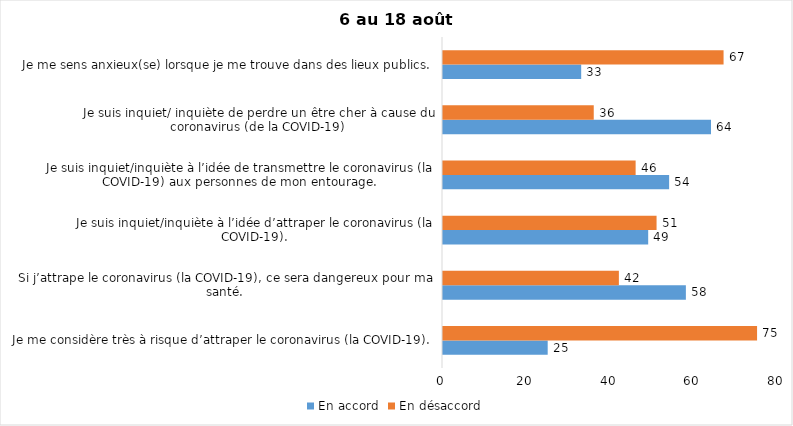
| Category | En accord | En désaccord |
|---|---|---|
| Je me considère très à risque d’attraper le coronavirus (la COVID-19). | 25 | 75 |
| Si j’attrape le coronavirus (la COVID-19), ce sera dangereux pour ma santé. | 58 | 42 |
| Je suis inquiet/inquiète à l’idée d’attraper le coronavirus (la COVID-19). | 49 | 51 |
| Je suis inquiet/inquiète à l’idée de transmettre le coronavirus (la COVID-19) aux personnes de mon entourage. | 54 | 46 |
| Je suis inquiet/ inquiète de perdre un être cher à cause du coronavirus (de la COVID-19) | 64 | 36 |
| Je me sens anxieux(se) lorsque je me trouve dans des lieux publics. | 33 | 67 |